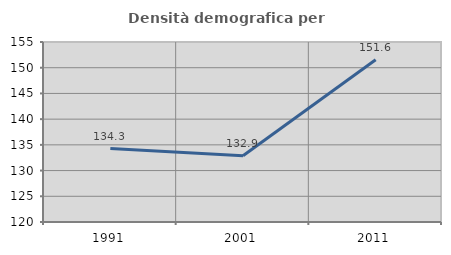
| Category | Densità demografica |
|---|---|
| 1991.0 | 134.291 |
| 2001.0 | 132.875 |
| 2011.0 | 151.561 |